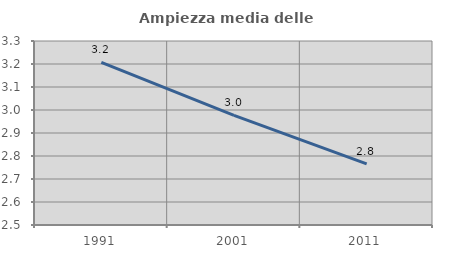
| Category | Ampiezza media delle famiglie |
|---|---|
| 1991.0 | 3.207 |
| 2001.0 | 2.977 |
| 2011.0 | 2.766 |